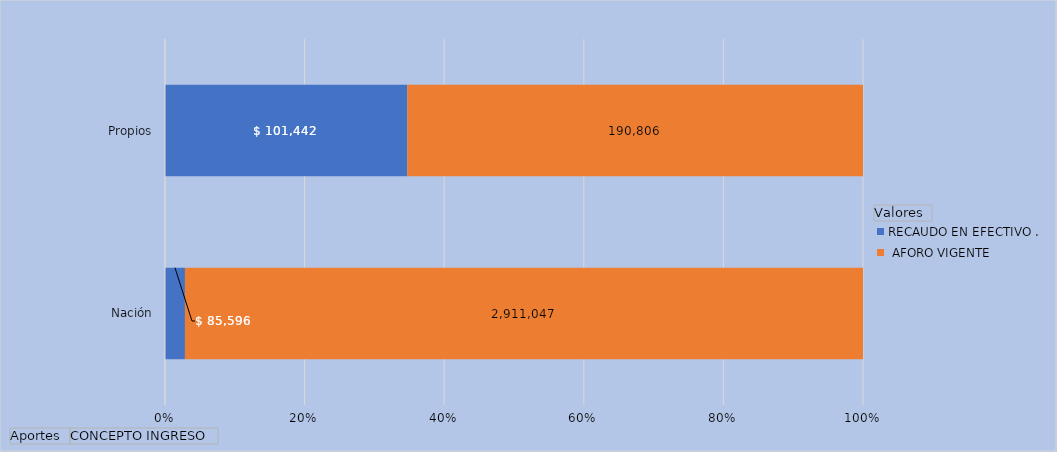
| Category | RECAUDO EN EFECTIVO . |  AFORO VIGENTE
 |
|---|---|---|
| Nación | 85595.968 | 2911046.911 |
| Propios | 101442.314 | 190805.665 |